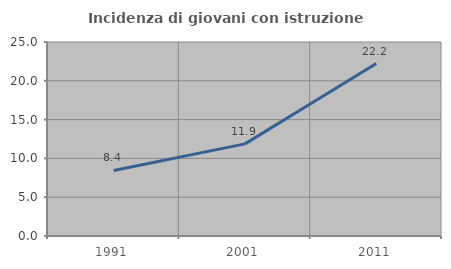
| Category | Incidenza di giovani con istruzione universitaria |
|---|---|
| 1991.0 | 8.45 |
| 2001.0 | 11.875 |
| 2011.0 | 22.222 |